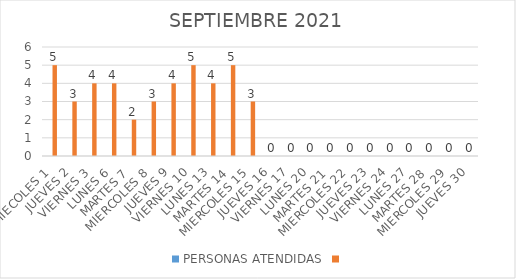
| Category | PERSONAS ATENDIDAS | Series 1 |
|---|---|---|
| MIECOLES 1 |  | 5 |
| JUEVES 2 |  | 3 |
| VIERNES 3 |  | 4 |
| LUNES 6 |  | 4 |
| MARTES 7 |  | 2 |
| MIERCOLES 8 |  | 3 |
| JUEVES 9 |  | 4 |
| VIERNES 10 |  | 5 |
| LUNES 13 |  | 4 |
| MARTES 14 |  | 5 |
| MIERCOLES 15 |  | 3 |
| JUEVES 16 |  | 0 |
| VIERNES 17 |  | 0 |
| LUNES 20 |  | 0 |
| MARTES 21 |  | 0 |
| MIERCOLES 22 |  | 0 |
| JUEVES 23 |  | 0 |
| VIERNES 24 |  | 0 |
| LUNES 27 |  | 0 |
| MARTES 28 |  | 0 |
| MIERCOLES 29 |  | 0 |
| JUEVES 30 |  | 0 |